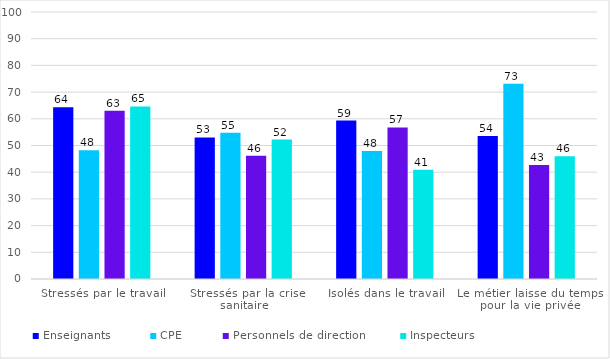
| Category | Enseignants | CPE | Personnels de direction | Inspecteurs |
|---|---|---|---|---|
| Stressés par le travail | 64.342 | 48.257 | 63.004 | 64.629 |
| Stressés par la crise sanitaire | 53.007 | 54.819 | 46.168 | 52.227 |
| Isolés dans le travail | 59.341 | 47.968 | 56.75 | 40.949 |
| Le métier laisse du temps pour la vie privée | 53.533 | 73.167 | 42.674 | 45.928 |